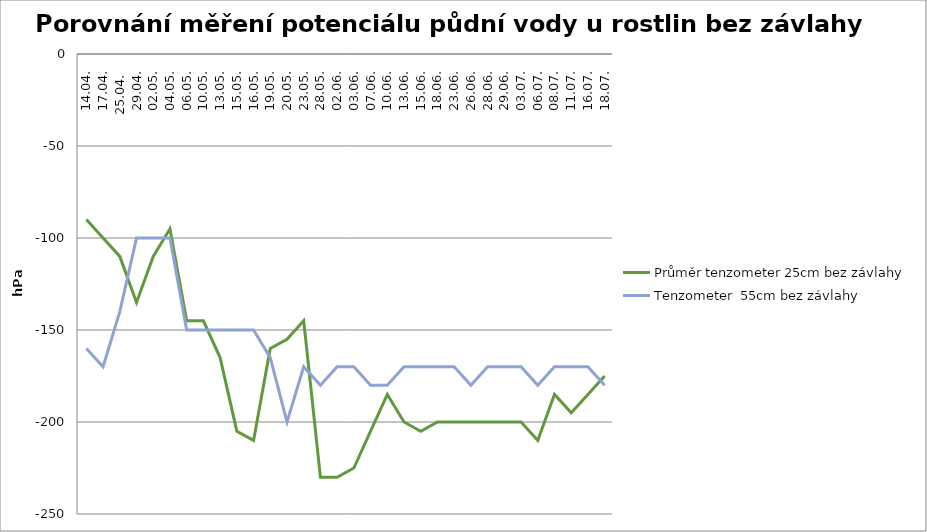
| Category | Tenzometer 2 - 25cm | Průměr tenzometer 25cm pod závlahou | Tenzometer 55cm pod závlahou | Tenzometer 1 - 25cm | Průměr tenzometer 25cm bez závlahy | Tenzometer  55cm bez závlahy |
|---|---|---|---|---|---|---|
| 14.04. |  |  |  |  | -90 | -160 |
| 17.04. |  |  |  |  | -100 | -170 |
| 25.04.  |  |  |  |  | -110 | -140 |
| 29.04. |  |  |  |  | -135 | -100 |
| 02.05. |  |  |  |  | -110 | -100 |
| 04.05. |  |  |  |  | -95 | -100 |
| 06.05. |  |  |  |  | -145 | -150 |
| 10.05. |  |  |  |  | -145 | -150 |
| 13.05. |  |  |  |  | -165 | -150 |
| 15.05. |  |  |  |  | -205 | -150 |
| 16.05. |  |  |  |  | -210 | -150 |
| 19.05. |  |  |  |  | -160 | -165 |
| 20.05. |  |  |  |  | -155 | -200 |
| 23.05. |  |  |  |  | -145 | -170 |
| 28.05. |  |  |  |  | -230 | -180 |
| 02.06. |  |  |  |  | -230 | -170 |
| 03.06. |  |  |  |  | -225 | -170 |
| 07.06. |  |  |  |  | -205 | -180 |
| 10.06. |  |  |  |  | -185 | -180 |
| 13.06. |  |  |  |  | -200 | -170 |
| 15.06. |  |  |  |  | -205 | -170 |
| 18.06. |  |  |  |  | -200 | -170 |
| 23.06. |  |  |  |  | -200 | -170 |
| 26.06. |  |  |  |  | -200 | -180 |
| 28.06. |  |  |  |  | -200 | -170 |
| 29.06. |  |  |  |  | -200 | -170 |
| 03.07. |  |  |  |  | -200 | -170 |
| 06.07. |  |  |  |  | -210 | -180 |
| 08.07. |  |  |  |  | -185 | -170 |
| 11.07. |  |  |  |  | -195 | -170 |
| 16.07. |  |  |  |  | -185 | -170 |
| 18.07. |  |  |  |  | -175 | -180 |